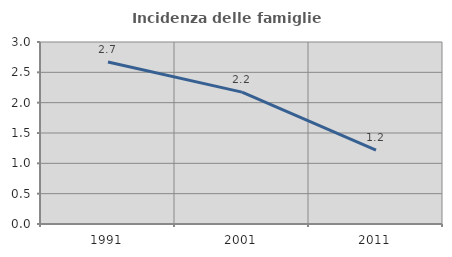
| Category | Incidenza delle famiglie numerose |
|---|---|
| 1991.0 | 2.671 |
| 2001.0 | 2.174 |
| 2011.0 | 1.22 |